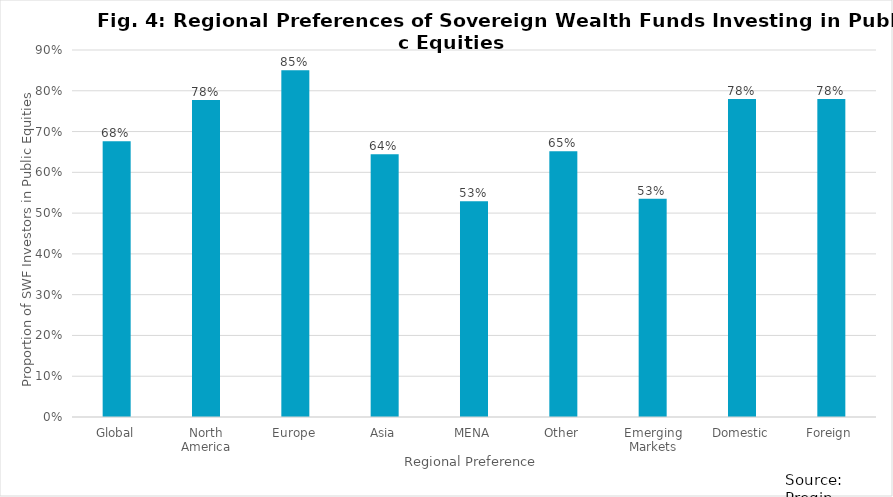
| Category | Series 0 |
|---|---|
| Global | 0.676 |
| North America | 0.778 |
| Europe | 0.851 |
| Asia | 0.645 |
| MENA | 0.529 |
| Other | 0.652 |
| Emerging Markets | 0.535 |
| Domestic | 0.78 |
| Foreign | 0.78 |